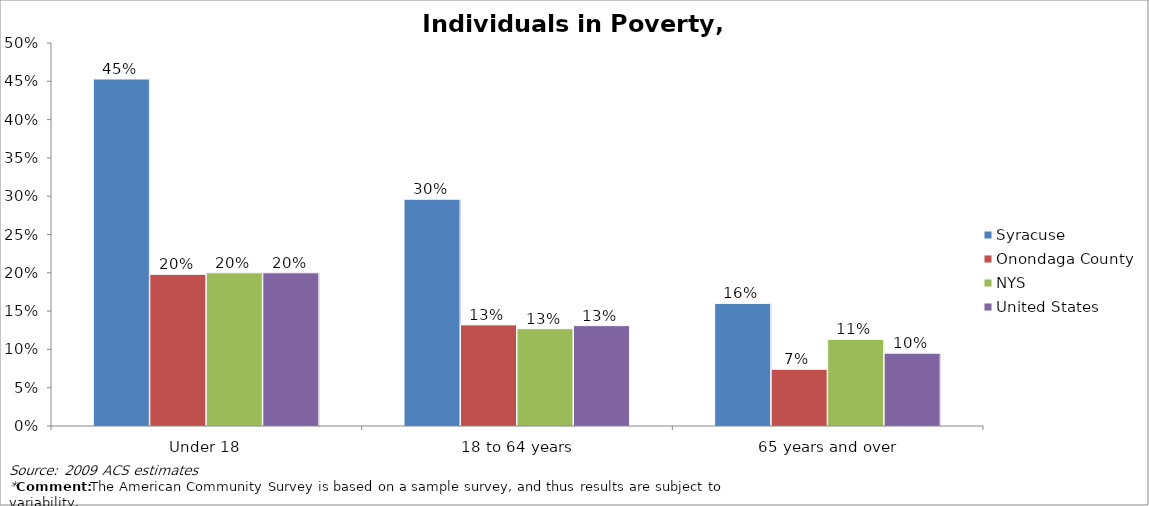
| Category | Syracuse | Onondaga County | NYS | United States |
|---|---|---|---|---|
| Under 18 | 0.453 | 0.198 | 0.2 | 0.2 |
| 18 to 64 years | 0.296 | 0.132 | 0.127 | 0.131 |
| 65 years and over | 0.16 | 0.074 | 0.113 | 0.095 |